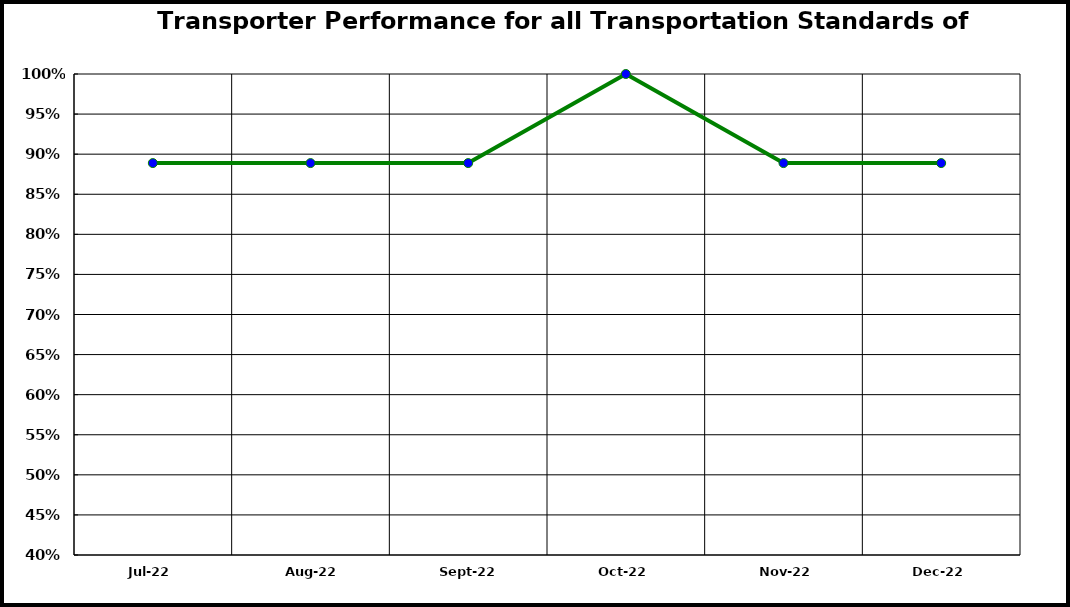
| Category | Performance |
|---|---|
| 2022-07-01 | 0.889 |
| 2022-08-01 | 0.889 |
| 2022-09-01 | 0.889 |
| 2022-10-01 | 1 |
| 2022-11-01 | 0.889 |
| 2022-12-01 | 0.889 |